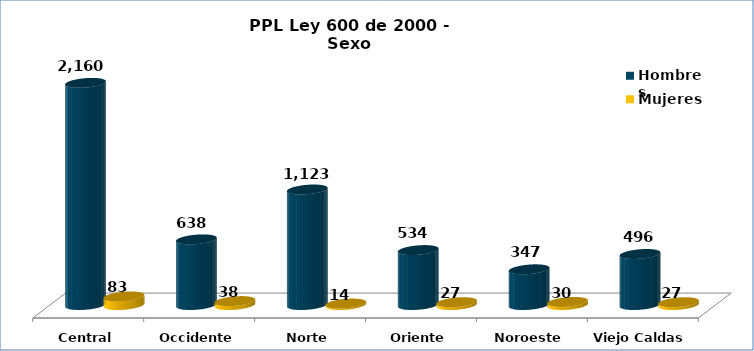
| Category | Hombres | Mujeres |
|---|---|---|
| Central | 2160 | 83 |
| Occidente | 638 | 38 |
| Norte | 1123 | 14 |
| Oriente | 534 | 27 |
| Noroeste | 347 | 30 |
| Viejo Caldas | 496 | 27 |